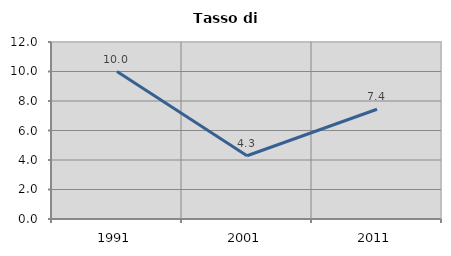
| Category | Tasso di disoccupazione   |
|---|---|
| 1991.0 | 9.992 |
| 2001.0 | 4.288 |
| 2011.0 | 7.44 |